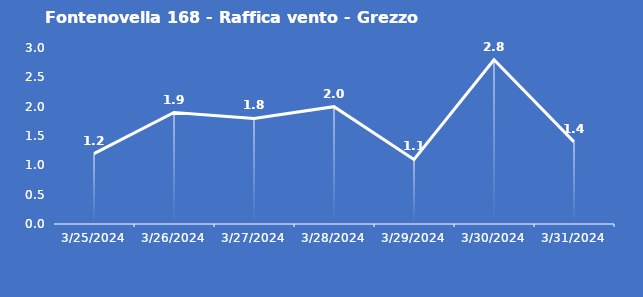
| Category | Fontenovella 168 - Raffica vento - Grezzo (m/s) |
|---|---|
| 3/25/24 | 1.2 |
| 3/26/24 | 1.9 |
| 3/27/24 | 1.8 |
| 3/28/24 | 2 |
| 3/29/24 | 1.1 |
| 3/30/24 | 2.8 |
| 3/31/24 | 1.4 |